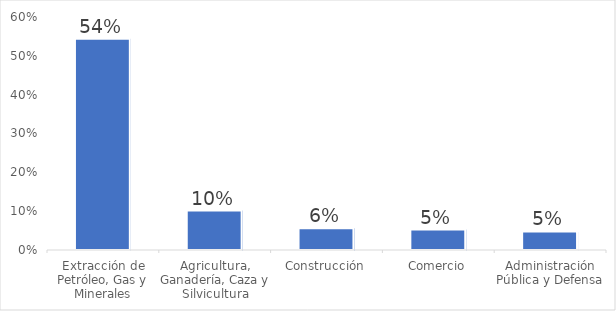
| Category | Series 0 |
|---|---|
| Extracción de Petróleo, Gas y Minerales | 0.544 |
| Agricultura, Ganadería, Caza y Silvicultura | 0.102 |
| Construcción | 0.056 |
| Comercio | 0.053 |
| Administración Pública y Defensa | 0.048 |